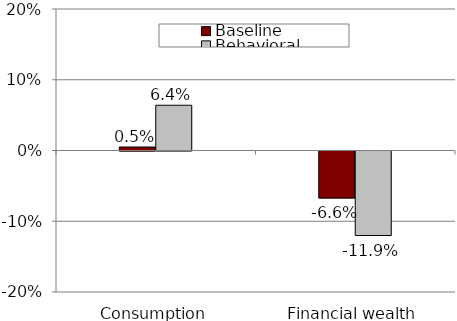
| Category | Baseline | Behavioral |
|---|---|---|
| Consumption | 0.005 | 0.064 |
| Financial wealth | -0.066 | -0.119 |